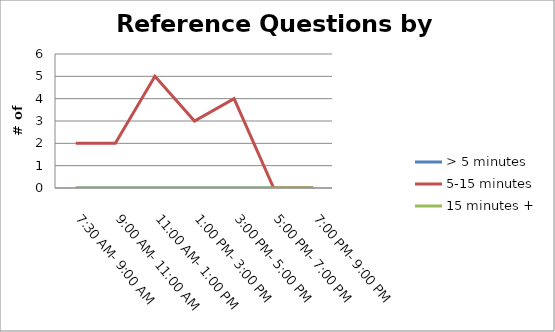
| Category | > 5 minutes | 5-15 minutes | 15 minutes + |
|---|---|---|---|
| 7:30 AM- 9:00 AM | 0 | 2 | 0 |
| 9:00 AM- 11:00 AM | 0 | 2 | 0 |
| 11:00 AM- 1:00 PM | 0 | 5 | 0 |
| 1:00 PM- 3:00 PM | 0 | 3 | 0 |
| 3:00 PM- 5:00 PM | 0 | 4 | 0 |
| 5:00 PM- 7:00 PM | 0 | 0 | 0 |
| 7:00 PM- 9:00 PM | 0 | 0 | 0 |